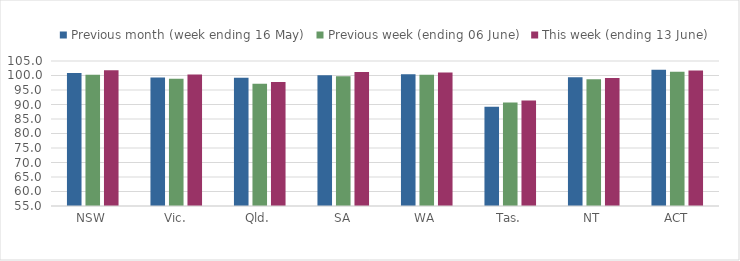
| Category | Previous month (week ending 16 May) | Previous week (ending 06 June) | This week (ending 13 June) |
|---|---|---|---|
| NSW | 100.879 | 100.299 | 101.835 |
| Vic. | 99.346 | 98.885 | 100.384 |
| Qld. | 99.216 | 97.132 | 97.74 |
| SA | 100.075 | 99.763 | 101.243 |
| WA | 100.391 | 100.284 | 101.054 |
| Tas. | 89.184 | 90.661 | 91.42 |
| NT | 99.437 | 98.687 | 99.129 |
| ACT | 101.999 | 101.333 | 101.753 |